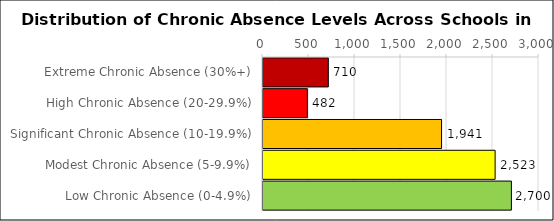
| Category | Number of Schools |
|---|---|
| Extreme Chronic Absence (30%+) | 710 |
| High Chronic Absence (20-29.9%) | 482 |
| Significant Chronic Absence (10-19.9%) | 1941 |
| Modest Chronic Absence (5-9.9%) | 2523 |
| Low Chronic Absence (0-4.9%) | 2700 |